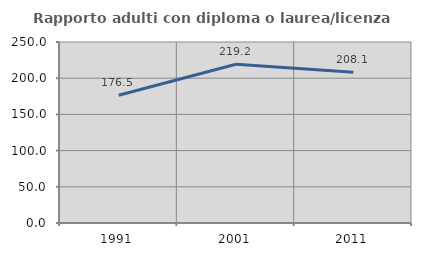
| Category | Rapporto adulti con diploma o laurea/licenza media  |
|---|---|
| 1991.0 | 176.471 |
| 2001.0 | 219.231 |
| 2011.0 | 208.108 |